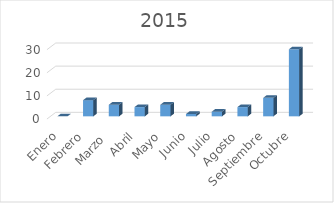
| Category | Series 0 |
|---|---|
| Enero | 0 |
| Febrero | 7 |
| Marzo  | 5 |
| Abril | 4 |
| Mayo | 5 |
| Junio | 1 |
| Julio | 2 |
| Agosto | 4 |
| Septiembre | 8 |
| Octubre | 29 |